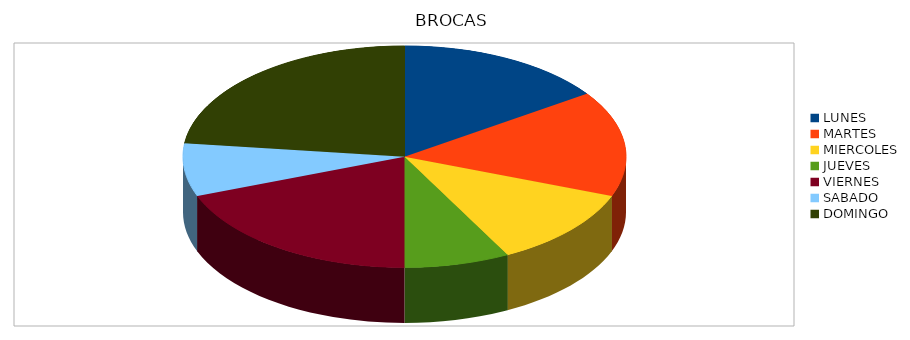
| Category | Series 0 |
|---|---|
| LUNES | 2624 |
| MARTES | 2624 |
| MIERCOLES | 1968 |
| JUEVES | 1312 |
| VIERNES | 3280 |
| SABADO | 1312 |
| DOMINGO | 3936 |